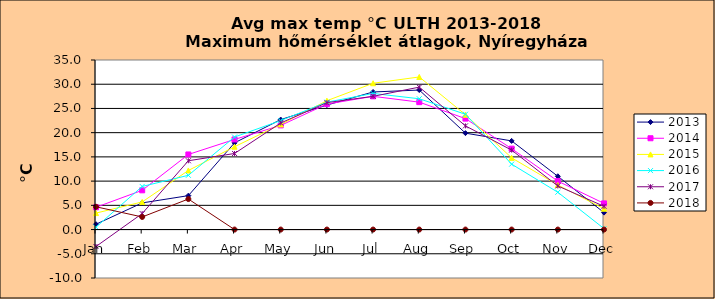
| Category | 2013 | 2014 | 2015 | 2016 | 2017 | 2018 |
|---|---|---|---|---|---|---|
| Jan | 1.1 | 4.6 | 3.4 | 0.5 | -3.5 | 4.7 |
| Feb | 5.5 | 8.1 | 5.7 | 8.9 | 3.3 | 2.6 |
| Mar | 7 | 15.5 | 12.2 | 11.2 | 14.2 | 6.3 |
| Apr | 17.9 | 18.6 | 17.1 | 19.1 | 15.7 | 0 |
| May | 22.7 | 21.5 | 21.7 | 22.5 | 22 | 0 |
| Jun | 25.7 | 25.9 | 26.6 | 26.3 | 26.2 | 0 |
| Jul | 28.4 | 27.5 | 30.2 | 28.1 | 27.5 | 0 |
| Aug | 28.8 | 26.3 | 31.5 | 27 | 29.4 | 0 |
| Sep | 19.9 | 22.9 | 23.7 | 23.8 | 21.4 | 0 |
| Oct | 18.3 | 16.7 | 14.8 | 13.5 | 16.4 | 0 |
| Nov | 11 | 10 | 9.2 | 7.7 | 9 | 0 |
| Dec | 3.5 | 5.4 | 4.3 | 0.2 | 4.8 | 0 |